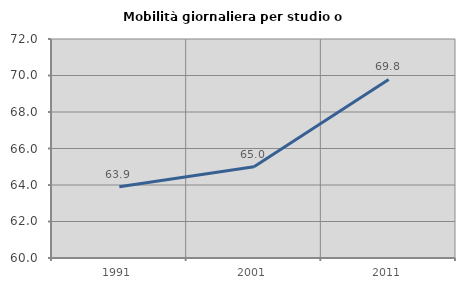
| Category | Mobilità giornaliera per studio o lavoro |
|---|---|
| 1991.0 | 63.909 |
| 2001.0 | 65.005 |
| 2011.0 | 69.784 |